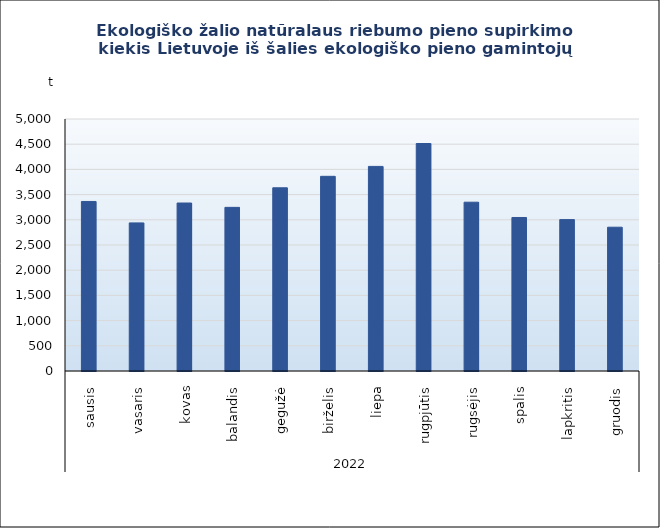
| Category | Ekologiško žalio natūralaus riebumo pieno supirkimo kiekis Lietuvoje iš šalies ekologiško pieno gamintojų |
|---|---|
| 0 | 3363.811 |
| 1 | 2938.532 |
| 2 | 3332.908 |
| 3 | 3246.816 |
| 4 | 3635.056 |
| 5 | 3862.811 |
| 6 | 4059.563 |
| 7 | 4513.644 |
| 8 | 3349.19 |
| 9 | 3045.692 |
| 10 | 3003.594 |
| 11 | 2853.064 |